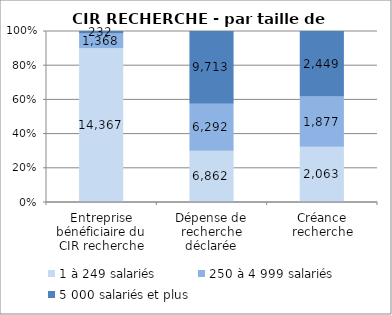
| Category | 1 à 249 salariés | 250 à 4 999 salariés | 5 000 salariés et plus |
|---|---|---|---|
| Entreprise bénéficiaire du CIR recherche | 14367 | 1368 | 232 |
| Dépense de recherche déclarée | 6861.95 | 6292.1 | 9712.83 |
| Créance recherche | 2062.84 | 1876.9 | 2448.65 |